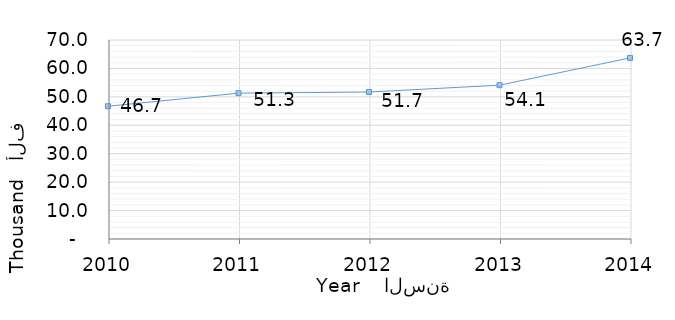
| Category | القيمة
Value |
|---|---|
| 2014.0 | 63.7 |
| 2013.0 | 54.1 |
| 2012.0 | 51.7 |
| 2011.0 | 51.3 |
| 2010.0 | 46.7 |